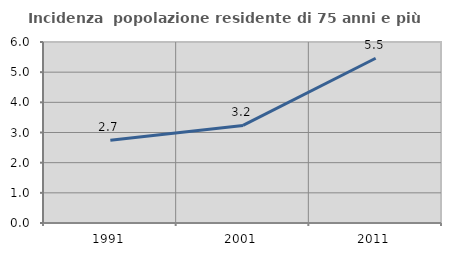
| Category | Incidenza  popolazione residente di 75 anni e più |
|---|---|
| 1991.0 | 2.745 |
| 2001.0 | 3.235 |
| 2011.0 | 5.461 |